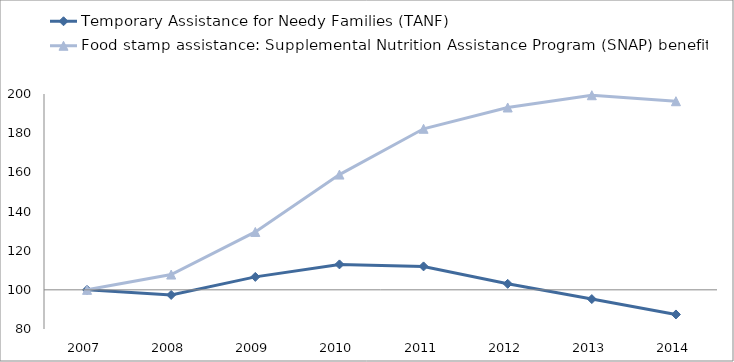
| Category | Temporary Assistance for Needy Families (TANF)  | Food stamp assistance: Supplemental Nutrition Assistance Program (SNAP) benefits |
|---|---|---|
| 2007.0 | 100 | 100 |
| 2008.0 | 97.387 | 107.801 |
| 2009.0 | 106.609 | 129.56 |
| 2010.0 | 112.987 | 158.86 |
| 2011.0 | 111.963 | 182.237 |
| 2012.0 | 103.074 | 193.113 |
| 2013.0 | 95.28 | 199.363 |
| 2014.0 | 87.424 | 196.312 |